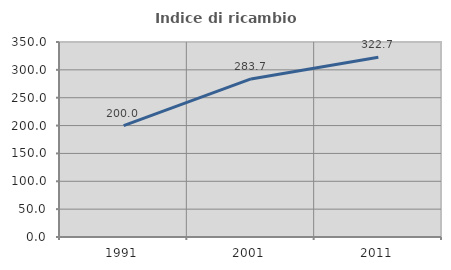
| Category | Indice di ricambio occupazionale  |
|---|---|
| 1991.0 | 200 |
| 2001.0 | 283.721 |
| 2011.0 | 322.727 |